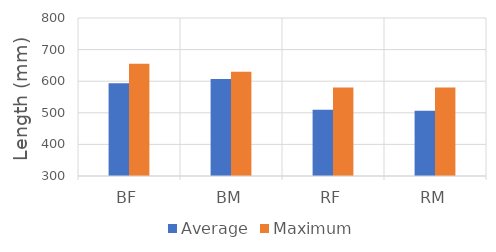
| Category | Average | Maximum |
|---|---|---|
| BF | 593.333 | 655 |
| BM | 606.667 | 630 |
| RF | 509.348 | 580 |
| RM | 506.143 | 580 |